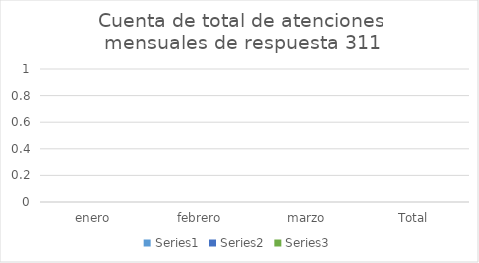
| Category | Series 0 | Series 1 | Series 2 | Series 3 | Series 4 | Series 5 |
|---|---|---|---|---|---|---|
| enero | 0 |  |  |  |  | 0 |
| febrero | 0 |  |  |  |  | 0 |
| marzo | 0 |  |  |  |  | 0 |
| Total | 0 |  |  |  |  | 0 |